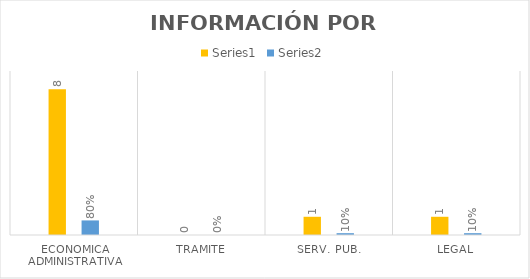
| Category | Series 3 | Series 4 |
|---|---|---|
| ECONOMICA ADMINISTRATIVA | 8 | 0.8 |
| TRAMITE | 0 | 0 |
| SERV. PUB. | 1 | 0.1 |
| LEGAL | 1 | 0.1 |